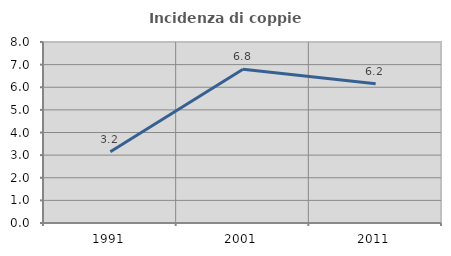
| Category | Incidenza di coppie miste |
|---|---|
| 1991.0 | 3.152 |
| 2001.0 | 6.799 |
| 2011.0 | 6.159 |